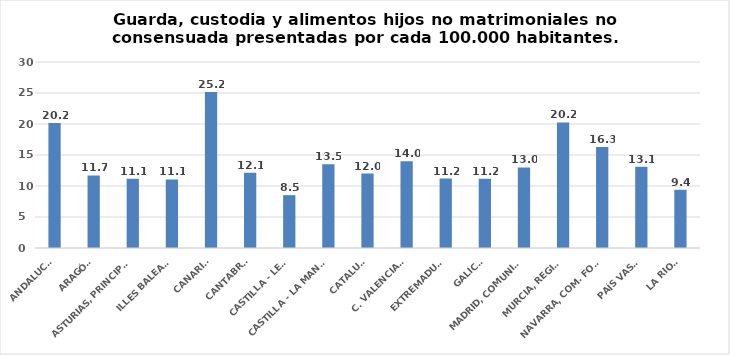
| Category | Series 0 |
|---|---|
| ANDALUCÍA | 20.18 |
| ARAGÓN | 11.695 |
| ASTURIAS, PRINCIPADO | 11.15 |
| ILLES BALEARS | 11.052 |
| CANARIAS | 25.179 |
| CANTABRIA | 12.132 |
| CASTILLA - LEÓN | 8.523 |
| CASTILLA - LA MANCHA | 13.498 |
| CATALUÑA | 12.013 |
| C. VALENCIANA | 13.986 |
| EXTREMADURA | 11.193 |
| GALICIA | 11.156 |
| MADRID, COMUNIDAD | 13.003 |
| MURCIA, REGIÓN | 20.242 |
| NAVARRA, COM. FORAL | 16.275 |
| PAÍS VASCO | 13.094 |
| LA RIOJA | 9.39 |